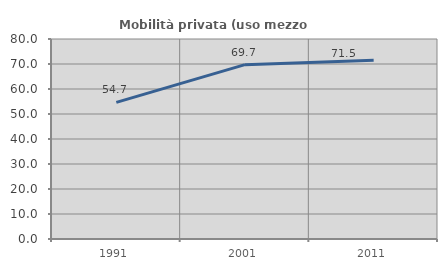
| Category | Mobilità privata (uso mezzo privato) |
|---|---|
| 1991.0 | 54.651 |
| 2001.0 | 69.731 |
| 2011.0 | 71.457 |